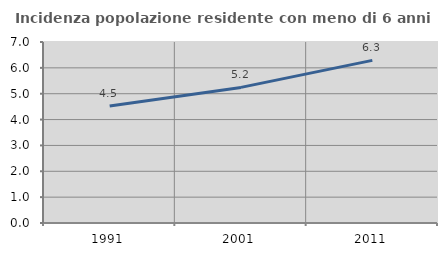
| Category | Incidenza popolazione residente con meno di 6 anni |
|---|---|
| 1991.0 | 4.522 |
| 2001.0 | 5.244 |
| 2011.0 | 6.289 |